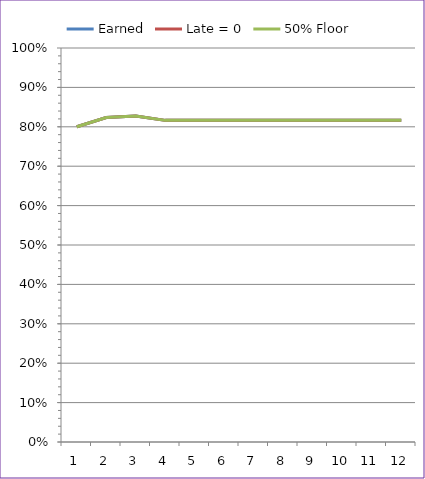
| Category | Earned | Late = 0 | 50% Floor |
|---|---|---|---|
| 0 | 0.8 | 0.8 | 0.8 |
| 1 | 0.824 | 0.824 | 0.824 |
| 2 | 0.828 | 0.828 | 0.828 |
| 3 | 0.816 | 0.816 | 0.816 |
| 4 | 0.816 | 0.816 | 0.816 |
| 5 | 0.816 | 0.816 | 0.816 |
| 6 | 0.816 | 0.816 | 0.816 |
| 7 | 0.816 | 0.816 | 0.816 |
| 8 | 0.816 | 0.816 | 0.816 |
| 9 | 0.816 | 0.816 | 0.816 |
| 10 | 0.816 | 0.816 | 0.816 |
| 11 | 0.816 | 0.816 | 0.816 |